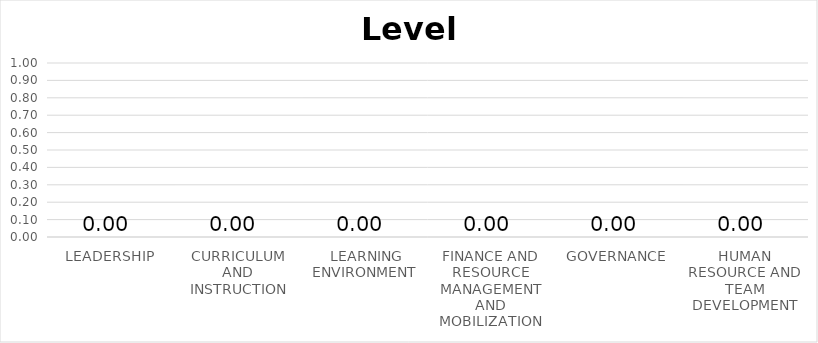
| Category | Series 2 |
|---|---|
| LEADERSHIP | 0 |
| CURRICULUM AND INSTRUCTION | 0 |
|  LEARNING ENVIRONMENT | 0 |
| FINANCE AND RESOURCE MANAGEMENT AND MOBILIZATION | 0 |
| GOVERNANCE | 0 |
| HUMAN RESOURCE AND TEAM DEVELOPMENT | 0 |